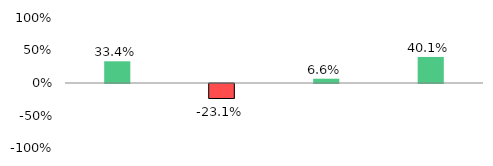
| Category | Series 1 |
|---|---|
| Absolute Deposit | 0.334 |
| CASA Deposit | -0.231 |
| Average Deposit | 0.066 |
| Weekly Deposit  10-09-2015 | 0.401 |